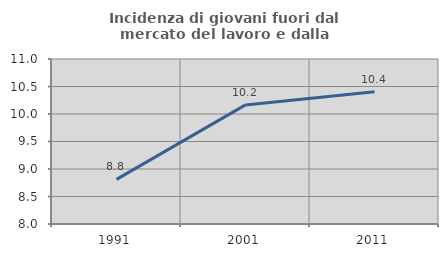
| Category | Incidenza di giovani fuori dal mercato del lavoro e dalla formazione  |
|---|---|
| 1991.0 | 8.811 |
| 2001.0 | 10.165 |
| 2011.0 | 10.403 |